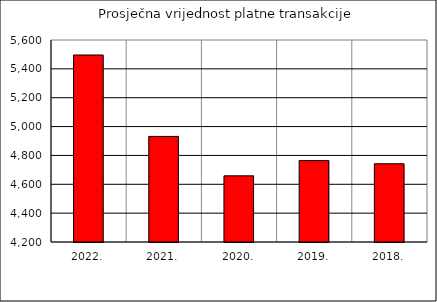
| Category | Prosječna vrijednost platne transakcije |
|---|---|
| 2022. | 5496 |
| 2021. | 4931.816 |
| 2020. | 4658.548 |
| 2019. | 4764.383 |
| 2018. | 4742.211 |